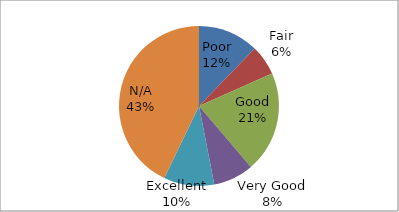
| Category | Series 0 |
|---|---|
| Poor | 6 |
| Fair | 3 |
| Good | 10 |
| Very Good | 4 |
| Excellent | 5 |
| N/A | 21 |